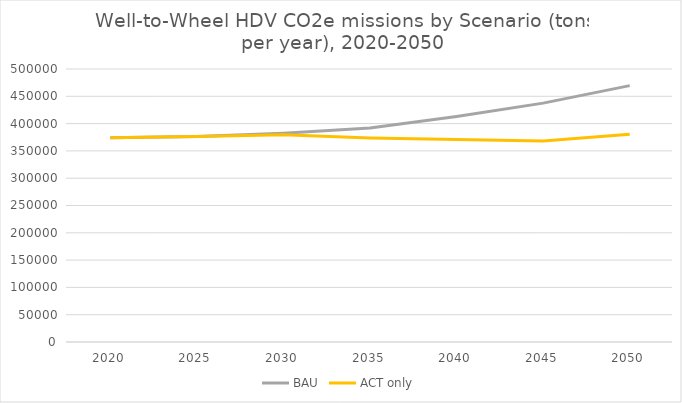
| Category | BAU | ACT only |
|---|---|---|
| 2020.0 | 373970.52 | 373970.52 |
| 2025.0 | 376180.002 | 376180.002 |
| 2030.0 | 382394.231 | 379568.779 |
| 2035.0 | 391836.04 | 373506.219 |
| 2040.0 | 413137.749 | 370894.719 |
| 2045.0 | 437474.636 | 368342.122 |
| 2050.0 | 469572.545 | 380337.756 |